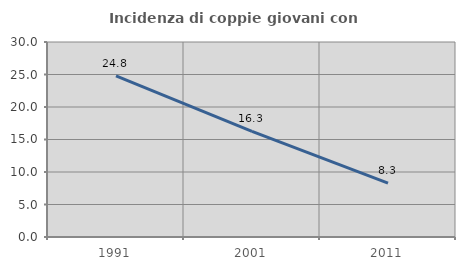
| Category | Incidenza di coppie giovani con figli |
|---|---|
| 1991.0 | 24.779 |
| 2001.0 | 16.255 |
| 2011.0 | 8.289 |